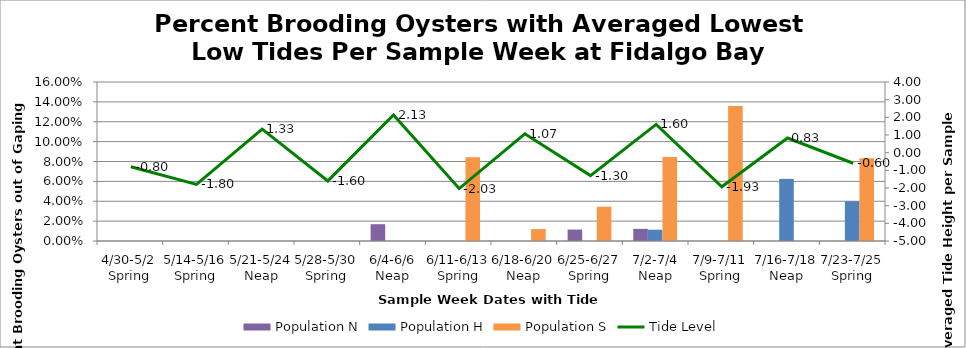
| Category | Population N | Population H | Population S |
|---|---|---|---|
| 4/30-5/2 Spring | 0 | 0 | 0 |
| 5/14-5/16 Spring | 0 | 0 | 0 |
| 5/21-5/24 Neap | 0 | 0 | 0 |
| 5/28-5/30 Spring | 0 | 0 | 0 |
| 6/4-6/6 Neap | 0.017 | 0 | 0 |
| 6/11-6/13 Spring | 0 | 0 | 0.084 |
| 6/18-6/20 Neap | 0 | 0 | 0.012 |
| 6/25-6/27 Spring | 0.012 | 0 | 0.034 |
| 7/2-7/4 Neap | 0.012 | 0.011 | 0.085 |
| 7/9-7/11 Spring | 0 | 0 | 0.136 |
| 7/16-7/18 Neap | 0 | 0.062 | 0 |
| 7/23-7/25 Spring | 0 | 0.04 | 0.083 |